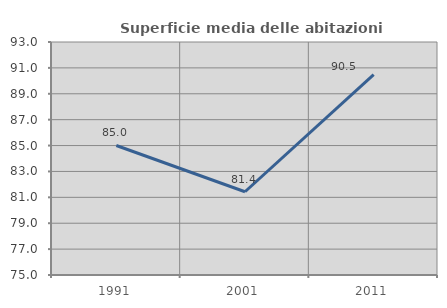
| Category | Superficie media delle abitazioni occupate |
|---|---|
| 1991.0 | 85.005 |
| 2001.0 | 81.431 |
| 2011.0 | 90.474 |